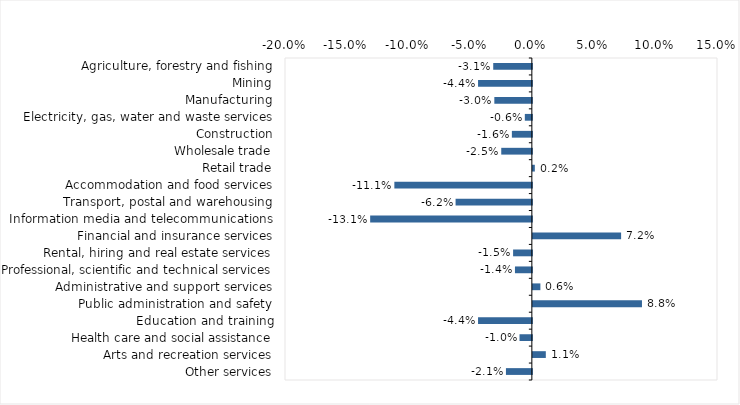
| Category | This week |
|---|---|
| Agriculture, forestry and fishing | -0.031 |
| Mining | -0.044 |
| Manufacturing | -0.03 |
| Electricity, gas, water and waste services | -0.006 |
| Construction | -0.016 |
| Wholesale trade | -0.025 |
| Retail trade | 0.002 |
| Accommodation and food services | -0.111 |
| Transport, postal and warehousing | -0.062 |
| Information media and telecommunications | -0.131 |
| Financial and insurance services | 0.072 |
| Rental, hiring and real estate services | -0.015 |
| Professional, scientific and technical services | -0.014 |
| Administrative and support services | 0.006 |
| Public administration and safety | 0.088 |
| Education and training | -0.044 |
| Health care and social assistance | -0.01 |
| Arts and recreation services | 0.01 |
| Other services | -0.021 |